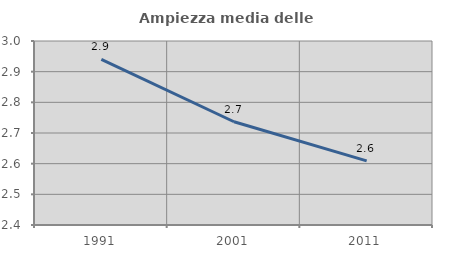
| Category | Ampiezza media delle famiglie |
|---|---|
| 1991.0 | 2.94 |
| 2001.0 | 2.737 |
| 2011.0 | 2.609 |